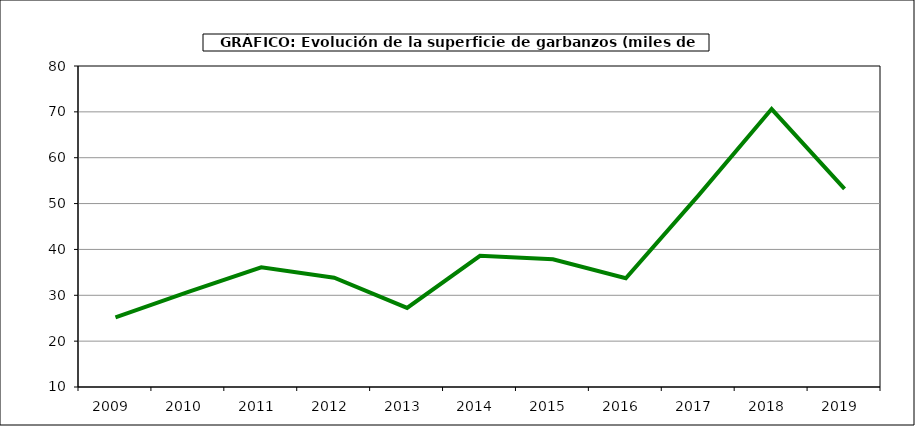
| Category | Superficie |
|---|---|
| 2009.0 | 25.195 |
| 2010.0 | 30.725 |
| 2011.0 | 36.097 |
| 2012.0 | 33.84 |
| 2013.0 | 27.252 |
| 2014.0 | 38.61 |
| 2015.0 | 37.869 |
| 2016.0 | 33.708 |
| 2017.0 | 51.856 |
| 2018.0 | 70.609 |
| 2019.0 | 53.224 |